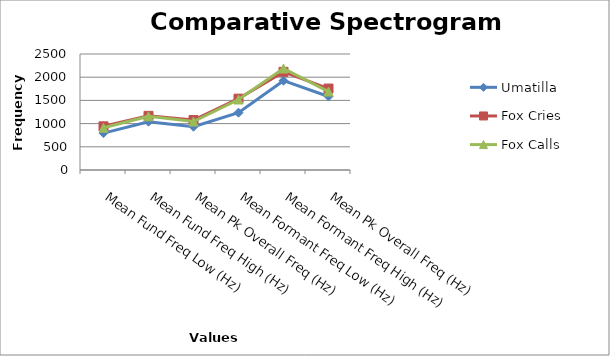
| Category | Umatilla | Fox Cries | Fox Calls |
|---|---|---|---|
| Mean Fund Freq Low (Hz) | 795.307 | 941.493 | 909.702 |
| Mean Fund Freq High (Hz) | 1041.391 | 1166.7 | 1156.1 |
| Mean Pk Overall Freq (Hz) | 933.036 | 1076.7 | 1044.375 |
| Mean Formant Freq Low (Hz) | 1234.757 | 1537.575 | 1519.05 |
| Mean Formant Freq High (Hz) | 1924.686 | 2115.1 | 2186.65 |
| Mean Pk Overall Freq (Hz) | 1584.843 | 1754.975 | 1690.375 |